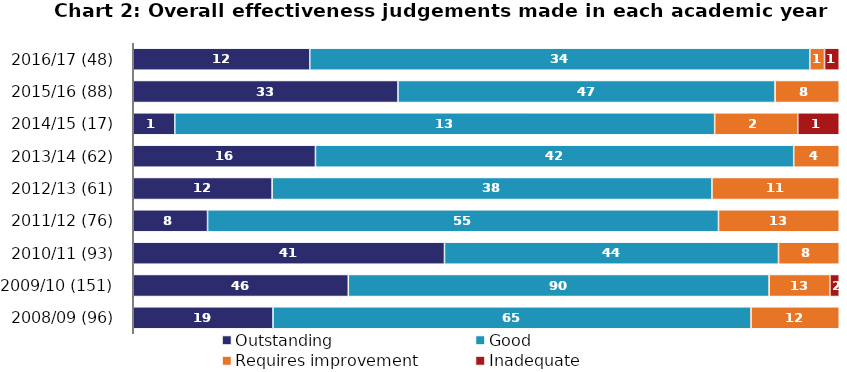
| Category | Outstanding | Good | Requires improvement | Inadequate |
|---|---|---|---|---|
| 2016/17 (48) | 12 | 34 | 1 | 1 |
| 2015/16 (88) | 33 | 47 | 8 | 0 |
| 2014/15 (17) | 1 | 13 | 2 | 1 |
| 2013/14 (62) | 16 | 42 | 4 | 0 |
| 2012/13 (61) | 12 | 38 | 11 | 0 |
| 2011/12 (76) | 8 | 55 | 13 | 0 |
| 2010/11 (93) | 41 | 44 | 8 | 0 |
| 2009/10 (151) | 46 | 90 | 13 | 2 |
| 2008/09 (96) | 19 | 65 | 12 | 0 |